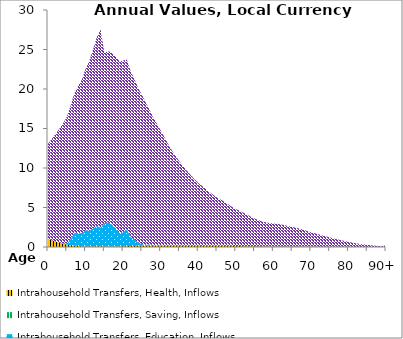
| Category | Intrahousehold Transfers, Health, Inflows | Intrahousehold Transfers, Saving, Inflows | Intrahousehold Transfers, Education, Inflows | Intrahousehold Transfers, Consumption other than health and education, Inflows |
|---|---|---|---|---|
| 0 | 996.566 |  | 0 | 12064.384 |
|  | 848.248 |  | 0 | 12835.682 |
| 2 | 704.973 |  | 0 | 13614.201 |
| 3 | 565.724 |  | 0 | 14403.41 |
| 4 | 429.587 |  | 0 | 15206.092 |
| 5 | 288.235 |  | 159.068 | 16024.379 |
| 6 | 226.614 |  | 775.046 | 16859.704 |
| 7 | 176.229 |  | 1569.024 | 17712.821 |
| 8 | 127.152 |  | 1644.709 | 18583.808 |
| 9 | 78.126 |  | 1637.02 | 19472.069 |
| 10 | 75.299 |  | 2071.833 | 20419.934 |
| 11 | 79.043 |  | 1952.378 | 21545.966 |
| 12 | 80.396 |  | 2259.214 | 22678.014 |
| 13 | 83.566 |  | 2594.464 | 23873.84 |
| 14 | 84.776 |  | 2372.513 | 25109.729 |
| 15 | 78.493 |  | 2955.998 | 21555.001 |
| 16 | 78.066 |  | 3039.668 | 21667.799 |
| 17 | 77.266 |  | 2734.862 | 21806.94 |
| 18 | 76.826 |  | 2229.104 | 21802.624 |
| 19 | 76.686 |  | 1672.82 | 21768.623 |
| 20 | 95.432 |  | 1763.291 | 21738.402 |
| 21 | 105.974 |  | 2155.288 | 21455.208 |
| 22 | 121.385 |  | 1150.825 | 20994.858 |
| 23 | 133.387 |  | 802.537 | 20339.861 |
| 24 | 150.353 |  | 433.744 | 19562.479 |
| 25 | 158.594 |  | 199.46 | 18895.245 |
| 26 | 167.126 |  | 108.629 | 18037.514 |
| 27 | 172.843 |  | 177.257 | 17075.407 |
| 28 | 185.576 |  | 31.095 | 16197.117 |
| 29 | 194.696 |  | 57.471 | 15340.526 |
| 30 | 205.927 |  | 46.868 | 14511.592 |
| 31 | 194.626 |  | 2.145 | 13696.668 |
| 32 | 188.761 |  | 9.494 | 12851.432 |
| 33 | 184.296 |  | 0 | 12033.634 |
| 34 | 179.671 |  | 25.232 | 11310.905 |
| 35 | 166.035 |  | 0 | 10665.652 |
| 36 | 160.408 |  | 0 | 10061.487 |
| 37 | 155.758 |  | 0 | 9484.515 |
| 38 | 155.716 |  | 0 | 8959.969 |
| 39 | 185.983 |  | 0 | 8393.271 |
| 40 | 176.018 |  | 0 | 7933.081 |
| 41 | 170.946 |  | 0 | 7567.456 |
| 42 | 168.475 |  | 0 | 7182.022 |
| 43 | 161.209 |  | 0 | 6799.756 |
| 44 | 160.245 |  | 0 | 6444.693 |
| 45 | 155.568 |  | 0 | 6118.179 |
| 46 | 158.751 |  | 0 | 5841.412 |
| 47 | 154.802 |  | 0 | 5562.421 |
| 48 | 154.482 |  | 0 | 5250.292 |
| 49 | 145.625 |  | 0 | 4937.066 |
| 50 | 116.863 |  | 0 | 4685.084 |
| 51 | 111.592 |  | 0 | 4489.201 |
| 52 | 104.227 |  | 0 | 4244.287 |
| 53 | 98.591 |  | 0 | 3995.502 |
| 54 | 93.561 |  | 0 | 3752.944 |
| 55 | 89.072 |  | 0 | 3515.921 |
| 56 | 81.996 |  | 0 | 3329.66 |
| 57 | 76.975 |  | 0 | 3149.31 |
| 58 | 73.597 |  | 0 | 3048.089 |
| 59 | 69.141 |  | 0 | 2965.565 |
| 60 | 67.073 |  | 0 | 2909.552 |
| 61 | 66.855 |  | 0 | 2862.99 |
| 62 | 69.802 |  | 0 | 2788.459 |
| 63 | 67.481 |  | 0 | 2685.861 |
| 64 | 67.182 |  | 0 | 2591.204 |
| 65 | 65.628 |  | 0 | 2484.251 |
| 66 | 62.527 |  | 0 | 2377.824 |
| 67 | 59.362 |  | 0 | 2262.767 |
| 68 | 58.59 |  | 0 | 2118.389 |
| 69 | 56.568 |  | 0 | 1969.091 |
| 70 | 52.771 |  | 0 | 1815.785 |
| 71 | 48.993 |  | 0 | 1705.445 |
| 72 | 43.24 |  | 0 | 1573.157 |
| 73 | 37.399 |  | 0 | 1438.766 |
| 74 | 33.524 |  | 0 | 1312.291 |
| 75 | 31.757 |  | 0 | 1183.216 |
| 76 | 28.537 |  | 0 | 1062.621 |
| 77 | 24.546 |  | 0 | 947.527 |
| 78 | 21.447 |  | 0 | 841.945 |
| 79 | 20.304 |  | 0 | 736.283 |
| 80 | 17.641 |  | 0 | 638.632 |
| 81 | 15.926 |  | 0 | 544.452 |
| 82 | 13.567 |  | 0 | 455.135 |
| 83 | 11.411 |  | 0 | 381.797 |
| 84 | 9.625 |  | 0 | 321.307 |
| 85 | 7.366 |  | 0 | 264.383 |
| 86 | 5.754 |  | 0 | 212.519 |
| 87 | 4.416 |  | 0 | 167.775 |
| 88 | 3.329 |  | 0 | 130.072 |
| 89 | 2.462 |  | 0 | 98.895 |
| 90+ | 5.504 |  | 0 | 227.247 |